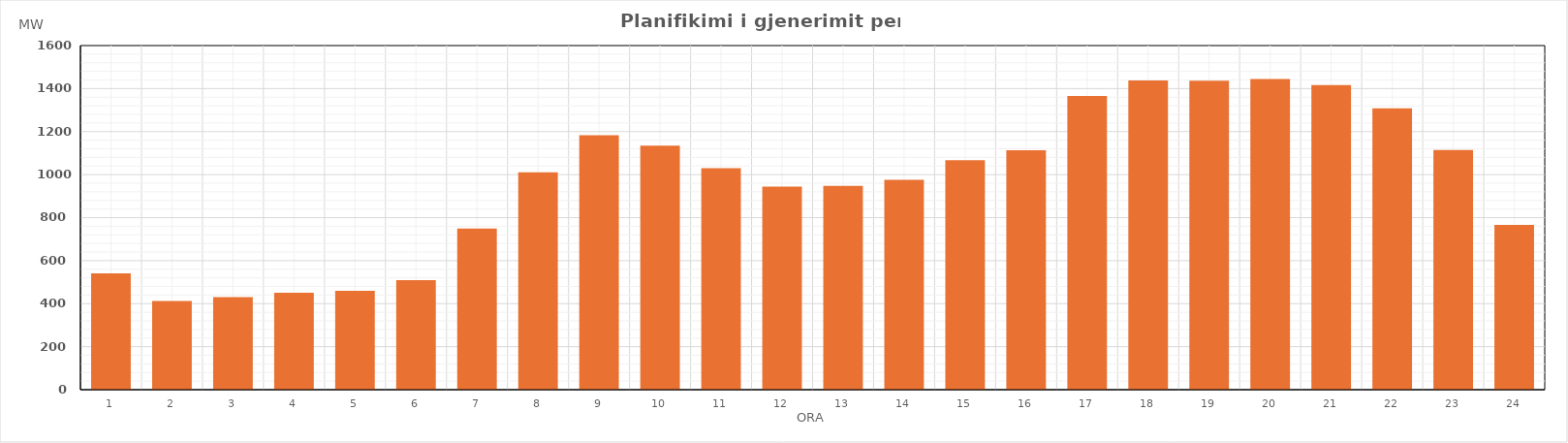
| Category | Max (MW) |
|---|---|
| 0 | 540.7 |
| 1 | 411.91 |
| 2 | 430.62 |
| 3 | 450.2 |
| 4 | 459.33 |
| 5 | 509.49 |
| 6 | 749.22 |
| 7 | 1010.87 |
| 8 | 1182.7 |
| 9 | 1134.9 |
| 10 | 1029.71 |
| 11 | 944.38 |
| 12 | 948.08 |
| 13 | 975.67 |
| 14 | 1067.38 |
| 15 | 1113.65 |
| 16 | 1366.08 |
| 17 | 1437.3 |
| 18 | 1436.81 |
| 19 | 1444.25 |
| 20 | 1415.91 |
| 21 | 1308.39 |
| 22 | 1114.48 |
| 23 | 766.14 |